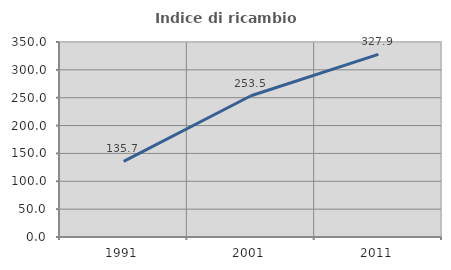
| Category | Indice di ricambio occupazionale  |
|---|---|
| 1991.0 | 135.696 |
| 2001.0 | 253.455 |
| 2011.0 | 327.869 |